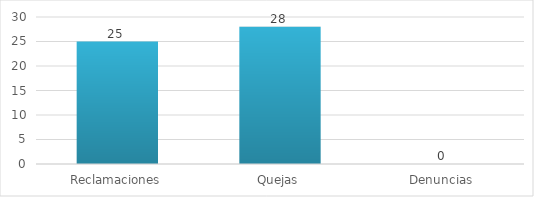
| Category | Series 0 |
|---|---|
| Reclamaciones | 25 |
| Quejas | 28 |
| Denuncias | 0 |